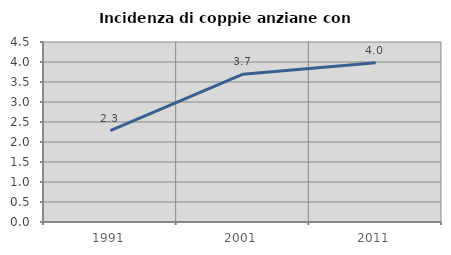
| Category | Incidenza di coppie anziane con figli |
|---|---|
| 1991.0 | 2.282 |
| 2001.0 | 3.695 |
| 2011.0 | 3.981 |